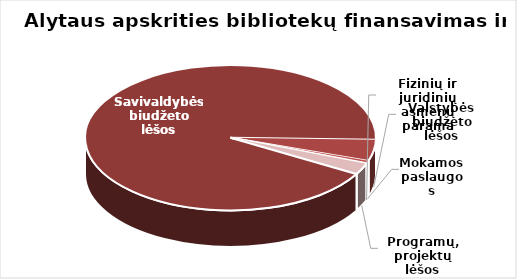
| Category | Series 0 |
|---|---|
| Savivaldybės biudžeto lėšos | 2164137.9 |
| Valstybės biudžeto lėšos | 110433 |
| Mokamos paslaugos | 12521.89 |
| Fizinių ir juridinių asmenų parama | 3718.08 |
| Programų, projektų lėšos | 58401 |